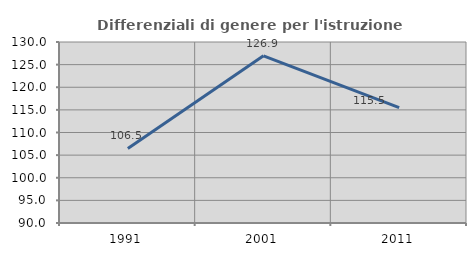
| Category | Differenziali di genere per l'istruzione superiore |
|---|---|
| 1991.0 | 106.469 |
| 2001.0 | 126.939 |
| 2011.0 | 115.478 |